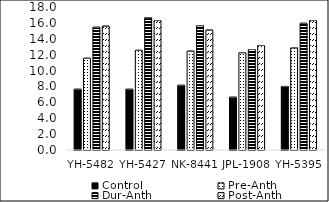
| Category | Control | Pre-Anth | Dur-Anth | Post-Anth |
|---|---|---|---|---|
| YH-5482 | 7.65 | 11.55 | 15.45 | 15.6 |
| YH-5427 | 7.65 | 12.55 | 16.65 | 16.3 |
| NK-8441 | 8.15 | 12.45 | 15.65 | 15.1 |
| JPL-1908 | 6.65 | 12.25 | 12.65 | 13.15 |
| YH-5395 | 8 | 12.85 | 15.95 | 16.3 |